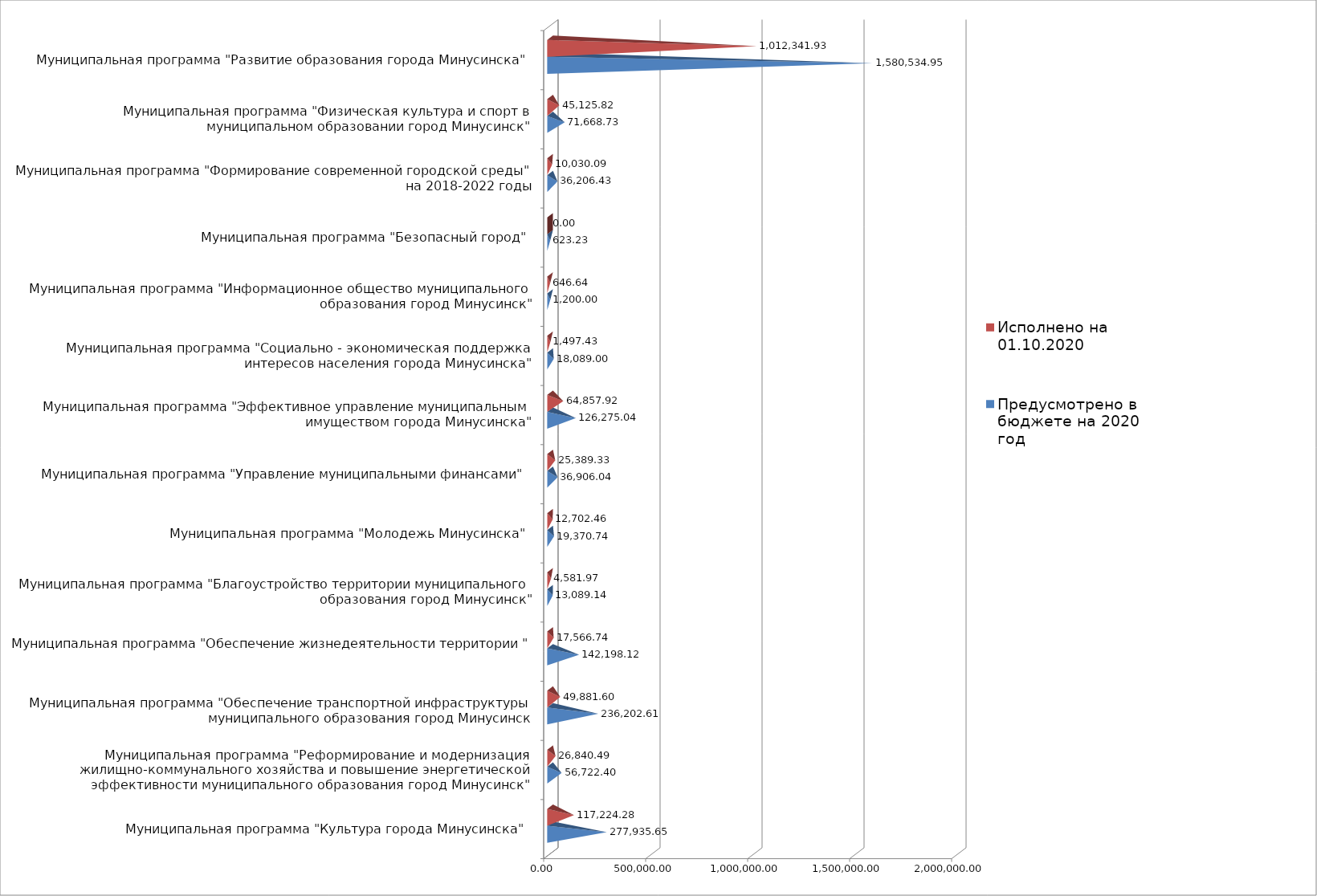
| Category | Предусмотрено в бюджете на 2020 год | Исполнено на 01.10.2020 |
|---|---|---|
| Муниципальная программа "Культура города Минусинска" | 277935.65 | 117224.28 |
| Муниципальная программа "Реформирование и модернизация жилищно-коммунального хозяйства и повышение энергетической эффективности муниципального образования город Минусинск" | 56722.4 | 26840.49 |
| Муниципальная программа "Обеспечение транспортной инфраструктуры муниципального образования город Минусинск | 236202.61 | 49881.6 |
| Муниципальная программа "Обеспечение жизнедеятельности территории " | 142198.12 | 17566.74 |
| Муниципальная программа "Благоустройство территории муниципального образования город Минусинск" | 13089.14 | 4581.97 |
| Муниципальная программа "Молодежь Минусинска" | 19370.74 | 12702.46 |
| Муниципальная программа "Управление муниципальными финансами" | 36906.04 | 25389.33 |
| Муниципальная программа "Эффективное управление муниципальным имуществом города Минусинска" | 126275.04 | 64857.92 |
| Муниципальная программа "Социально - экономическая поддержка интересов населения города Минусинска" | 18089 | 1497.43 |
| Муниципальная программа "Информационное общество муниципального образования город Минусинск" | 1200 | 646.64 |
| Муниципальная программа "Безопасный город" | 623.23 | 0 |
| Муниципальная программа "Формирование современной городской среды" на 2018-2022 годы | 36206.43 | 10030.09 |
| Муниципальная программа "Физическая культура и спорт в муниципальном образовании город Минусинск" | 71668.73 | 45125.82 |
| Муниципальная программа "Развитие образования города Минусинска" | 1580534.95 | 1012341.93 |